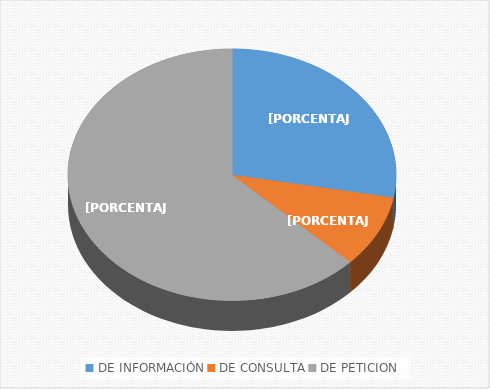
| Category | Series 0 |
|---|---|
| DE INFORMACIÓN | 12 |
| DE CONSULTA | 4 |
| DE PETICION | 27 |